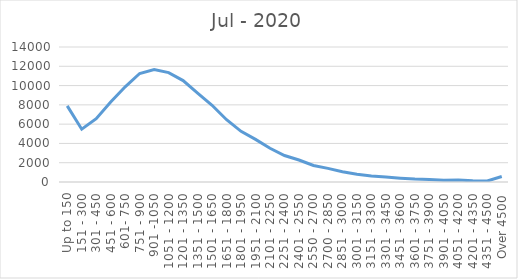
| Category | Jul - 2020 |
|---|---|
| Up to 150 | 7895 |
| 151 - 300 | 5475 |
| 301 - 450 | 6571 |
| 451 - 600 | 8289 |
| 601- 750 | 9873 |
| 751 - 900 | 11252 |
| 901 -1050 | 11655 |
| 1051 - 1200 | 11340 |
| 1201 - 1350 | 10515 |
| 1351 - 1500 | 9211 |
| 1501 - 1650 | 7960 |
| 1651 - 1800 | 6456 |
| 1801 - 1950 | 5255 |
| 1951 - 2100 | 4422 |
| 2101 - 2250 | 3502 |
| 2251 - 2400 | 2744 |
| 2401 - 2550 | 2277 |
| 2550 - 2700 | 1713 |
| 2700 - 2850 | 1413 |
| 2851 - 3000 | 1058 |
| 3001 - 3150 | 812 |
| 3151 - 3300 | 618 |
| 3301 - 3450 | 509 |
| 3451 - 3600 | 393 |
| 3601 - 3750 | 307 |
| 3751 - 3900 | 260 |
| 3901 - 4050 | 188 |
| 4051 - 4200 | 199 |
| 4201 - 4350 | 124 |
| 4351 - 4500 | 106 |
| Over 4500 | 566 |